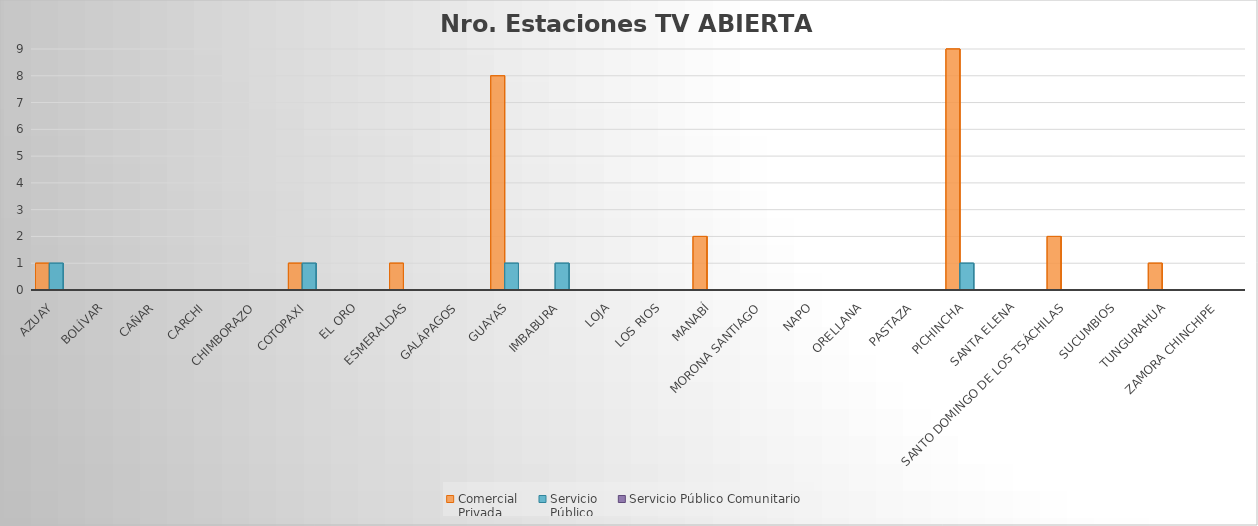
| Category | Comercial 
Privada | Servicio 
Público | Servicio Público Comunitario |
|---|---|---|---|
| Azuay | 1 | 1 | 0 |
| Bolívar | 0 | 0 | 0 |
| Cañar | 0 | 0 | 0 |
| Carchi | 0 | 0 | 0 |
| Chimborazo | 0 | 0 | 0 |
| Cotopaxi | 1 | 1 | 0 |
| El Oro | 0 | 0 | 0 |
| Esmeraldas | 1 | 0 | 0 |
| Galápagos | 0 | 0 | 0 |
| Guayas | 8 | 1 | 0 |
| Imbabura | 0 | 1 | 0 |
| Loja | 0 | 0 | 0 |
| Los Rios | 0 | 0 | 0 |
| Manabí | 2 | 0 | 0 |
| Morona Santiago | 0 | 0 | 0 |
| Napo | 0 | 0 | 0 |
| Orellana | 0 | 0 | 0 |
| Pastaza | 0 | 0 | 0 |
| Pichincha | 9 | 1 | 0 |
| Santa Elena | 0 | 0 | 0 |
| Santo Domingo de los Tsáchilas | 2 | 0 | 0 |
| Sucumbios | 0 | 0 | 0 |
| Tungurahua | 1 | 0 | 0 |
| Zamora Chinchipe | 0 | 0 | 0 |